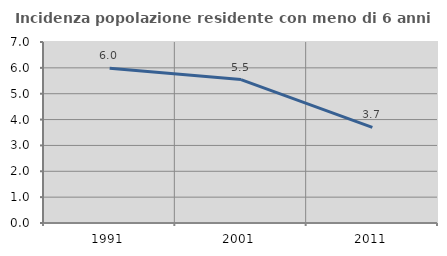
| Category | Incidenza popolazione residente con meno di 6 anni |
|---|---|
| 1991.0 | 5.983 |
| 2001.0 | 5.548 |
| 2011.0 | 3.701 |